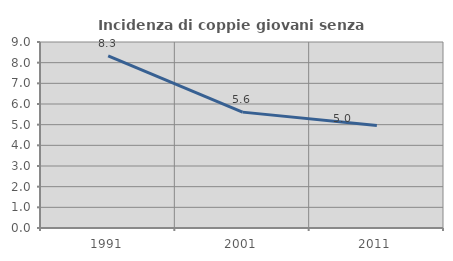
| Category | Incidenza di coppie giovani senza figli |
|---|---|
| 1991.0 | 8.326 |
| 2001.0 | 5.607 |
| 2011.0 | 4.964 |